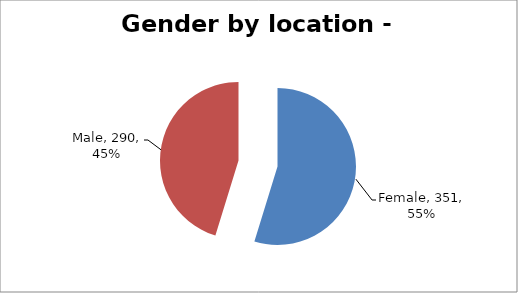
| Category | Leeds |
|---|---|
| Female | 351 |
| Male | 290 |